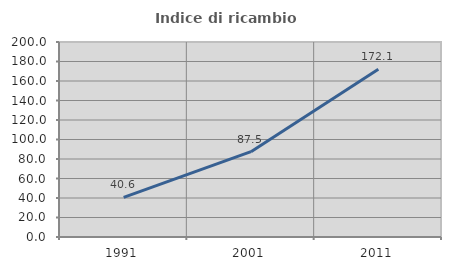
| Category | Indice di ricambio occupazionale  |
|---|---|
| 1991.0 | 40.594 |
| 2001.0 | 87.5 |
| 2011.0 | 172.059 |